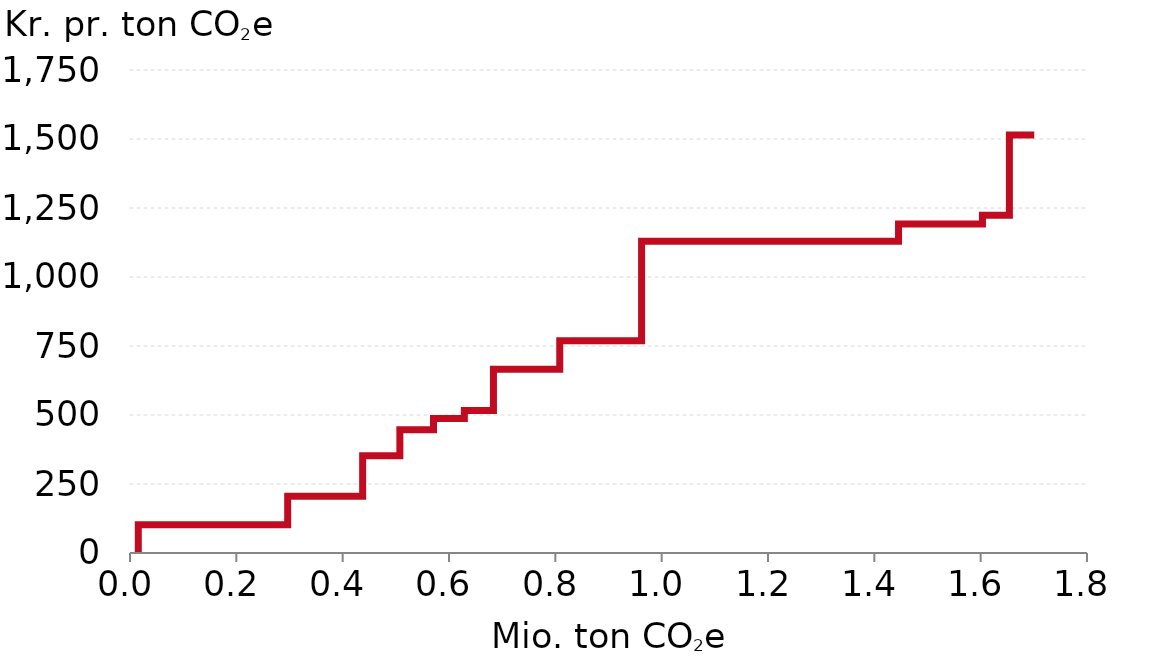
| Category | Series 0 |
|---|---|
| 15.58938773419862 | 0 |
| 15.58938773419862 | 102.237 |
| 296.5893877341986 | 102.237 |
| 296.5893877341986 | 205.61 |
| 437.5893877341986 | 205.61 |
| 437.5893877341986 | 352.149 |
| 507.5893877341986 | 352.149 |
| 507.5893877341986 | 447.003 |
| 570.8893877341986 | 447.003 |
| 570.8893877341986 | 487.67 |
| 628.8893877341986 | 487.67 |
| 628.8893877341986 | 516.41 |
| 683.5893877341987 | 516.41 |
| 683.5893877341987 | 665.605 |
| 808.3044896077877 | 665.605 |
| 808.3044896077877 | 769.293 |
| 962.2496934829991 | 769.293 |
| 962.2496934829991 | 1129.095 |
| 1445.5207132431563 | 1129.095 |
| 1445.5207132431563 | 1192.063 |
| 1603.3632640519172 | 1192.063 |
| 1603.3632640519172 | 1223.348 |
| 1654.0287741880627 | 1223.348 |
| 1654.0287741880627 | 1514.621 |
| 1700.7969373906585 | 1514.621 |